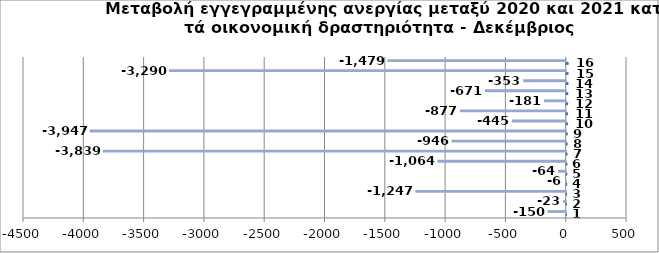
| Category | Series 0 | Series 1 |
|---|---|---|
| 0 | 1 | -150 |
| 1 | 2 | -23 |
| 2 | 3 | -1247 |
| 3 | 4 | -6 |
| 4 | 5 | -64 |
| 5 | 6 | -1064 |
| 6 | 7 | -3839 |
| 7 | 8 | -946 |
| 8 | 9 | -3947 |
| 9 | 10 | -445 |
| 10 | 11 | -877 |
| 11 | 12 | -181 |
| 12 | 13 | -671 |
| 13 | 14 | -353 |
| 14 | 15 | -3290 |
| 15 | 16 | -1479 |